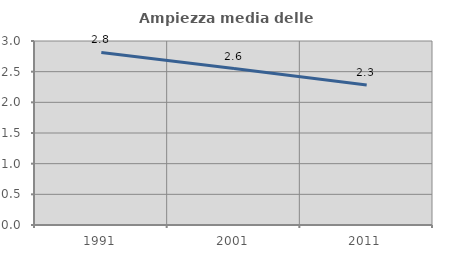
| Category | Ampiezza media delle famiglie |
|---|---|
| 1991.0 | 2.813 |
| 2001.0 | 2.552 |
| 2011.0 | 2.281 |